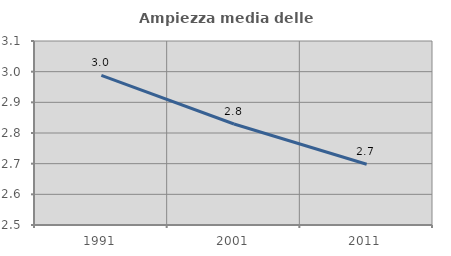
| Category | Ampiezza media delle famiglie |
|---|---|
| 1991.0 | 2.988 |
| 2001.0 | 2.829 |
| 2011.0 | 2.698 |